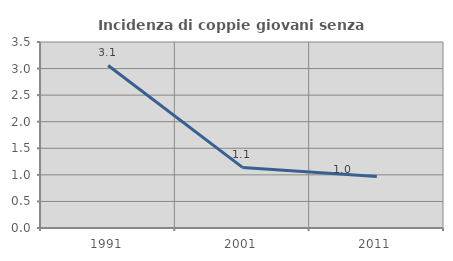
| Category | Incidenza di coppie giovani senza figli |
|---|---|
| 1991.0 | 3.058 |
| 2001.0 | 1.141 |
| 2011.0 | 0.971 |